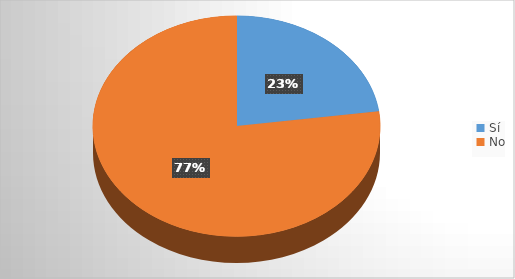
| Category | Series 0 |
|---|---|
| Sí | 21 |
| No | 71 |